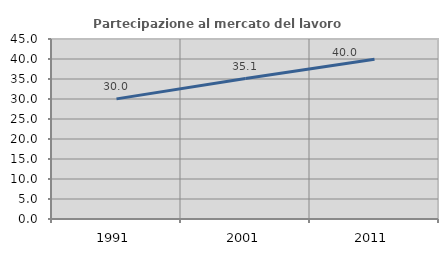
| Category | Partecipazione al mercato del lavoro  femminile |
|---|---|
| 1991.0 | 30.028 |
| 2001.0 | 35.113 |
| 2011.0 | 39.952 |